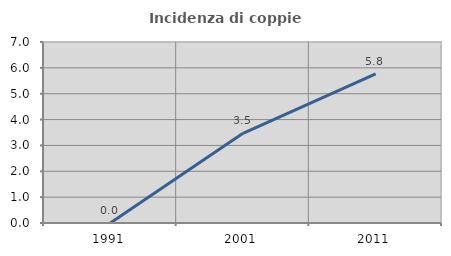
| Category | Incidenza di coppie miste |
|---|---|
| 1991.0 | 0 |
| 2001.0 | 3.47 |
| 2011.0 | 5.769 |